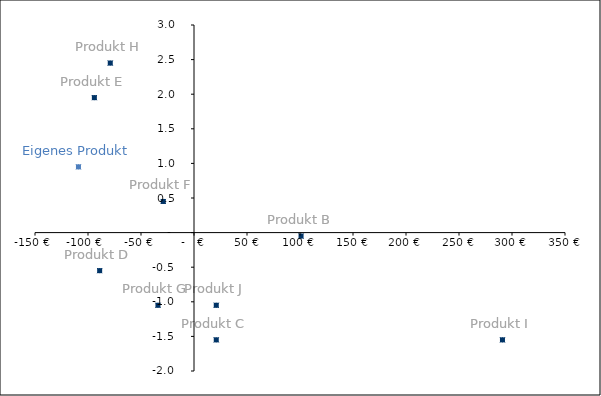
| Category | Series 0 |
|---|---|
| -109.0 | 0.95 |
| 101.0 | -0.05 |
| 21.0 | -1.55 |
| -89.0 | -0.55 |
| -94.0 | 1.95 |
| -29.0 | 0.45 |
| -34.0 | -1.05 |
| -79.0 | 2.45 |
| 291.0 | -1.55 |
| 21.0 | -1.05 |